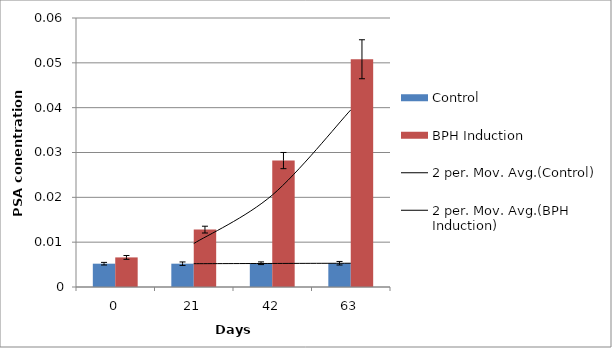
| Category | Control | BPH Induction |
|---|---|---|
| 0.0 | 0.005 | 0.007 |
| 21.0 | 0.005 | 0.013 |
| 42.0 | 0.005 | 0.028 |
| 63.0 | 0.005 | 0.051 |